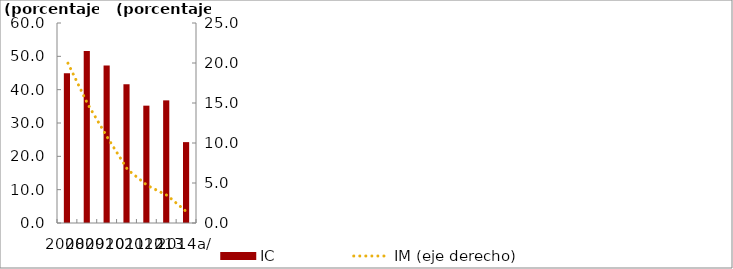
| Category | IC |
|---|---|
| 2008 | 44.927 |
| 2009 | 51.632 |
| 2010 | 47.234 |
| 2011 | 41.641 |
| 2012 | 35.202 |
| 2013 | 36.79 |
| 2014a/ | 24.263 |